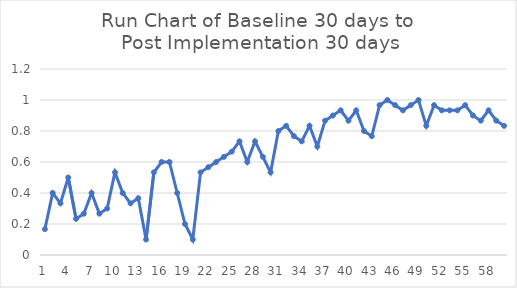
| Category | Run Chart of Baseline 30 days to Post Implementation 30 days |
|---|---|
| 0 | 0.167 |
| 1 | 0.4 |
| 2 | 0.333 |
| 3 | 0.5 |
| 4 | 0.233 |
| 5 | 0.267 |
| 6 | 0.4 |
| 7 | 0.267 |
| 8 | 0.3 |
| 9 | 0.533 |
| 10 | 0.4 |
| 11 | 0.333 |
| 12 | 0.367 |
| 13 | 0.1 |
| 14 | 0.533 |
| 15 | 0.6 |
| 16 | 0.6 |
| 17 | 0.4 |
| 18 | 0.2 |
| 19 | 0.1 |
| 20 | 0.533 |
| 21 | 0.567 |
| 22 | 0.6 |
| 23 | 0.633 |
| 24 | 0.667 |
| 25 | 0.733 |
| 26 | 0.6 |
| 27 | 0.733 |
| 28 | 0.633 |
| 29 | 0.533 |
| 30 | 0.8 |
| 31 | 0.833 |
| 32 | 0.767 |
| 33 | 0.733 |
| 34 | 0.833 |
| 35 | 0.7 |
| 36 | 0.867 |
| 37 | 0.9 |
| 38 | 0.933 |
| 39 | 0.867 |
| 40 | 0.933 |
| 41 | 0.8 |
| 42 | 0.767 |
| 43 | 0.967 |
| 44 | 1 |
| 45 | 0.967 |
| 46 | 0.933 |
| 47 | 0.967 |
| 48 | 1 |
| 49 | 0.833 |
| 50 | 0.967 |
| 51 | 0.933 |
| 52 | 0.933 |
| 53 | 0.933 |
| 54 | 0.967 |
| 55 | 0.9 |
| 56 | 0.867 |
| 57 | 0.933 |
| 58 | 0.867 |
| 59 | 0.833 |